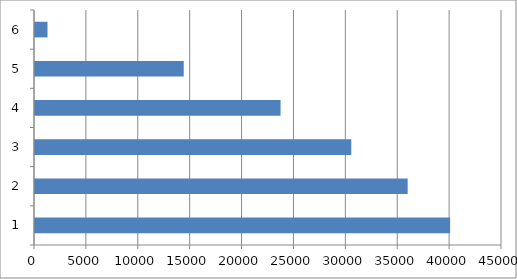
| Category | Series 0 |
|---|---|
| 0 | 40000 |
| 1 | 35912 |
| 2 | 30478 |
| 3 | 23663 |
| 4 | 14332 |
| 5 | 1206 |